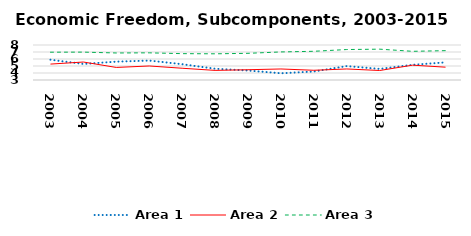
| Category | Area 1 | Area 2 | Area 3 |
|---|---|---|---|
| 2003.0 | 5.897 | 5.274 | 6.973 |
| 2004.0 | 5.292 | 5.569 | 6.983 |
| 2005.0 | 5.621 | 4.794 | 6.861 |
| 2006.0 | 5.777 | 5.003 | 6.88 |
| 2007.0 | 5.256 | 4.68 | 6.765 |
| 2008.0 | 4.612 | 4.372 | 6.742 |
| 2009.0 | 4.351 | 4.468 | 6.811 |
| 2010.0 | 3.961 | 4.575 | 7.009 |
| 2011.0 | 4.211 | 4.39 | 7.102 |
| 2012.0 | 4.988 | 4.577 | 7.352 |
| 2013.0 | 4.585 | 4.357 | 7.405 |
| 2014.0 | 5.17 | 5.118 | 7.098 |
| 2015.0 | 5.518 | 4.831 | 7.193 |